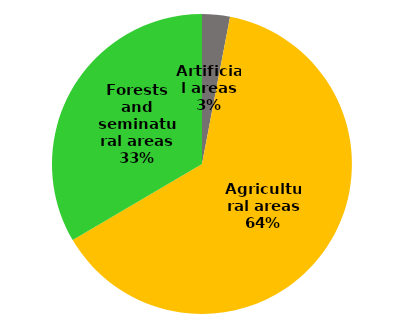
| Category | Series 0 |
|---|---|
| Artificial areas | 76.62 |
| Agricultural areas | 1624.59 |
| Forests and seminatural areas | 855.68 |